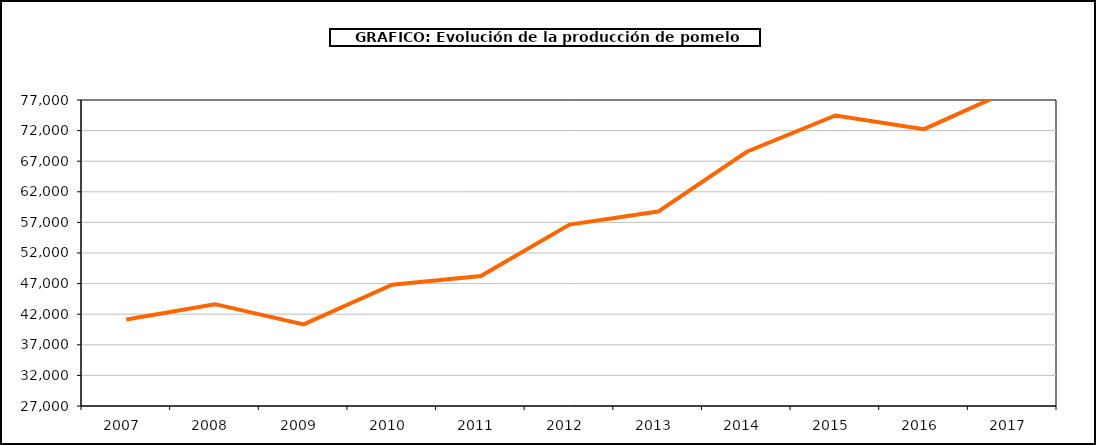
| Category | producción |
|---|---|
| 2007.0 | 41120 |
| 2008.0 | 43639 |
| 2009.0 | 40339 |
| 2010.0 | 46824 |
| 2011.0 | 48231 |
| 2012.0 | 56634 |
| 2013.0 | 58770 |
| 2014.0 | 68545 |
| 2015.0 | 74470 |
| 2016.0 | 72236 |
| 2017.0 | 78752 |